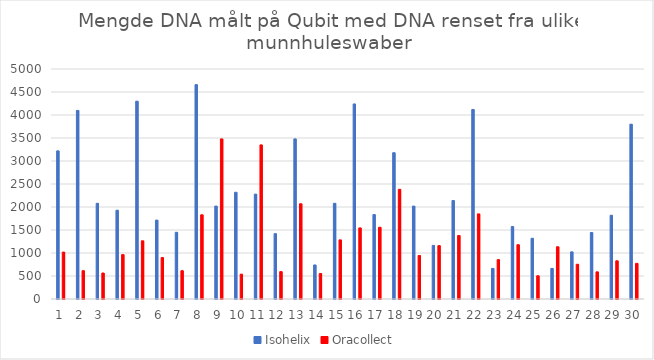
| Category | Isohelix | Oracollect |
|---|---|---|
| 1.0 | 3220 | 1020 |
| 2.0 | 4100 | 615 |
| 3.0 | 2080 | 565 |
| 4.0 | 1930 | 965 |
| 5.0 | 4300 | 1265 |
| 6.0 | 1715 | 900 |
| 7.0 | 1450 | 615 |
| 8.0 | 4660 | 1830 |
| 9.0 | 2020 | 3480 |
| 10.0 | 2320 | 540 |
| 11.0 | 2280 | 3350 |
| 12.0 | 1420 | 595 |
| 13.0 | 3480 | 2070 |
| 14.0 | 740 | 555 |
| 15.0 | 2080 | 1285 |
| 16.0 | 4240 | 1545 |
| 17.0 | 1835 | 1560 |
| 18.0 | 3180 | 2385 |
| 19.0 | 2020 | 945 |
| 20.0 | 1165 | 1160 |
| 21.0 | 2140 | 1380 |
| 22.0 | 4120 | 1850 |
| 23.0 | 665 | 855 |
| 24.0 | 1575 | 1180 |
| 25.0 | 1320 | 505 |
| 26.0 | 665 | 1135 |
| 27.0 | 1025 | 755 |
| 28.0 | 1445 | 590 |
| 29.0 | 1820 | 830 |
| 30.0 | 3800 | 775 |